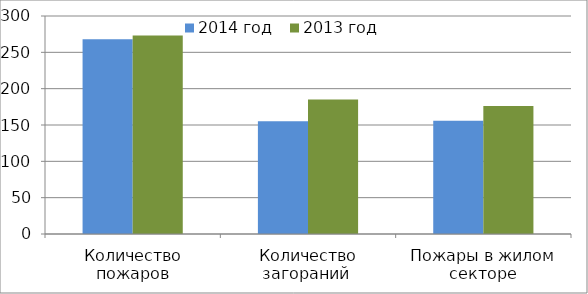
| Category | 2014 год | 2013 год |
|---|---|---|
| Количество пожаров | 268 | 273 |
| Количество загораний  | 155 | 185 |
| Пожары в жилом секторе | 156 | 176 |